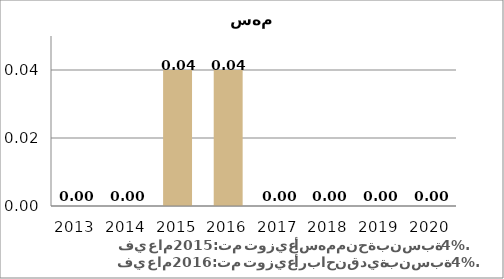
| Category | Series 1 |
|---|---|
| 2013.0 | 0 |
| 2014.0 | 0 |
| 2015.0 | 0.04 |
| 2016.0 | 0.04 |
| 2017.0 | 0 |
| 2018.0 | 0 |
| 2019.0 | 0 |
| 2020.0 | 0 |